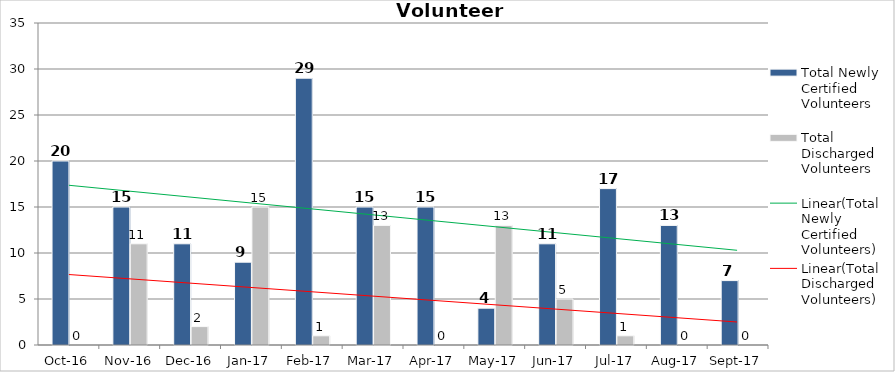
| Category | Total Newly Certified Volunteers | Total Discharged Volunteers |
|---|---|---|
| 2016-10-01 | 20 | 0 |
| 2016-11-01 | 15 | 11 |
| 2016-12-01 | 11 | 2 |
| 2017-01-01 | 9 | 15 |
| 2017-02-01 | 29 | 1 |
| 2017-03-01 | 15 | 13 |
| 2017-04-01 | 15 | 0 |
| 2017-05-01 | 4 | 13 |
| 2017-06-01 | 11 | 5 |
| 2017-07-01 | 17 | 1 |
| 2017-08-01 | 13 | 0 |
| 2017-09-01 | 7 | 0 |